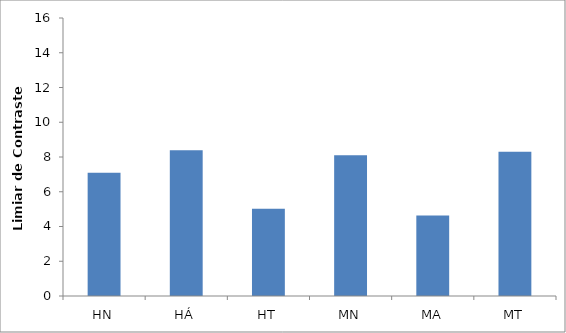
| Category | Series 0 |
|---|---|
| HN | 7.1 |
| HÁ | 8.386 |
| HT | 5.025 |
| MN | 8.1 |
| MA | 4.64 |
| MT | 8.3 |